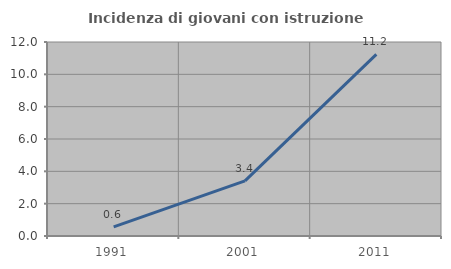
| Category | Incidenza di giovani con istruzione universitaria |
|---|---|
| 1991.0 | 0.568 |
| 2001.0 | 3.409 |
| 2011.0 | 11.23 |